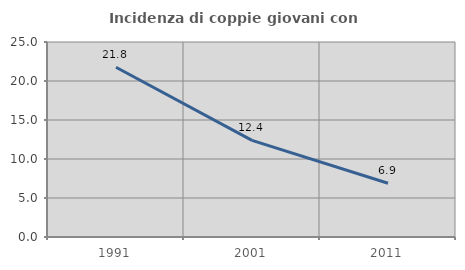
| Category | Incidenza di coppie giovani con figli |
|---|---|
| 1991.0 | 21.756 |
| 2001.0 | 12.381 |
| 2011.0 | 6.884 |